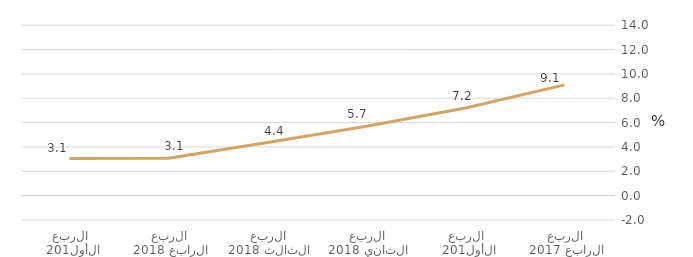
| Category | قطاع  الأسر المعيشية  |
|---|---|
| الربع الرابع 2017 | 9.1 |
| الربع الأول 2018 | 7.204 |
| الربع الثاني 2018 | 5.694 |
| الربع الثالث 2018 | 4.358 |
| الربع الرابع 2018 | 3.069 |
| الربع الأول 2019 | 3.053 |